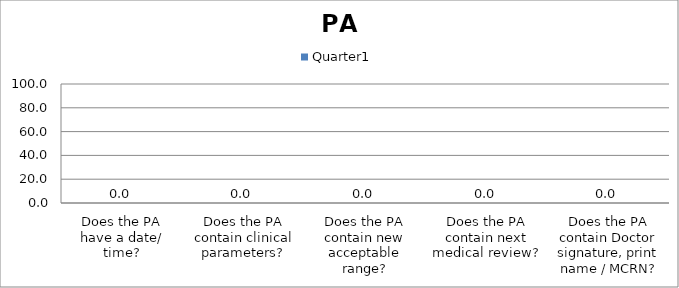
| Category | Quarter1 |
|---|---|
| Does the PA have a date/ time? | 0 |
| Does the PA contain clinical parameters? | 0 |
| Does the PA contain new acceptable range? | 0 |
| Does the PA contain next medical review? | 0 |
| Does the PA contain Doctor signature, print name / MCRN? | 0 |